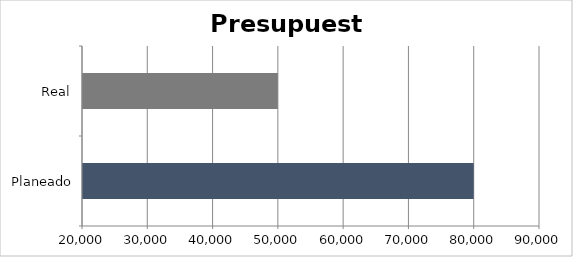
| Category | Series 0 |
|---|---|
| Planeado | 80000 |
| Real | 50000 |